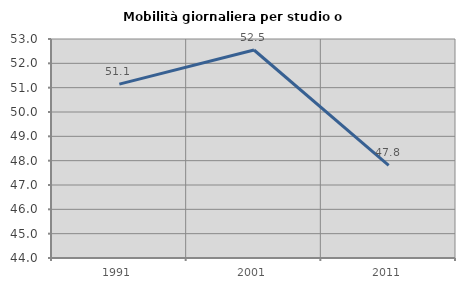
| Category | Mobilità giornaliera per studio o lavoro |
|---|---|
| 1991.0 | 51.145 |
| 2001.0 | 52.548 |
| 2011.0 | 47.808 |